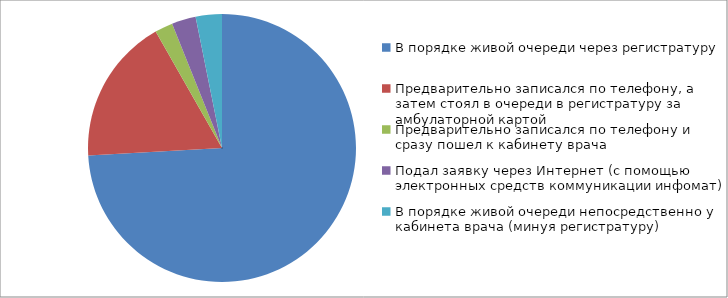
| Category | Series 0 |
|---|---|
| В порядке живой очереди через регистратуру | 1196 |
| Предварительно записался по телефону, а затем стоял в очереди в регистратуру за амбулаторной картой | 285 |
| Предварительно записался по телефону и сразу пошел к кабинету врача | 35 |
| Подал заявку через Интернет (с помощью электронных средств коммуникации инфомат) | 47 |
| В порядке живой очереди непосредственно у кабинета врача (минуя регистратуру) | 51 |